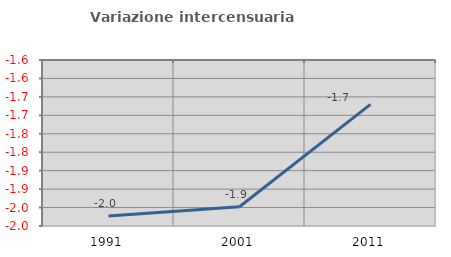
| Category | Variazione intercensuaria annua |
|---|---|
| 1991.0 | -1.973 |
| 2001.0 | -1.948 |
| 2011.0 | -1.67 |